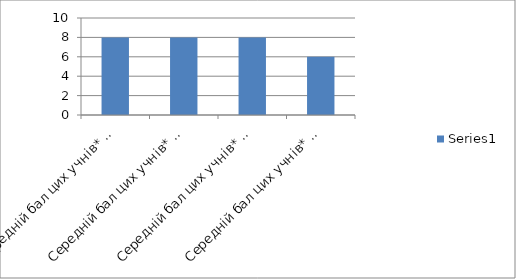
| Category | Series 0 |
|---|---|
| Середній бал цих учнів* за результатами ДПА у 9-му класі | 8 |
| Середній бал цих учнів* за результатами річного оцінювання у 10-му класі | 8 |
| Середній бал цих учнів* за результатами  річного оцінювання у 11-му класі | 8 |
| Середній бал цих учнів* за результатами ДПА у 11-му класі | 6 |